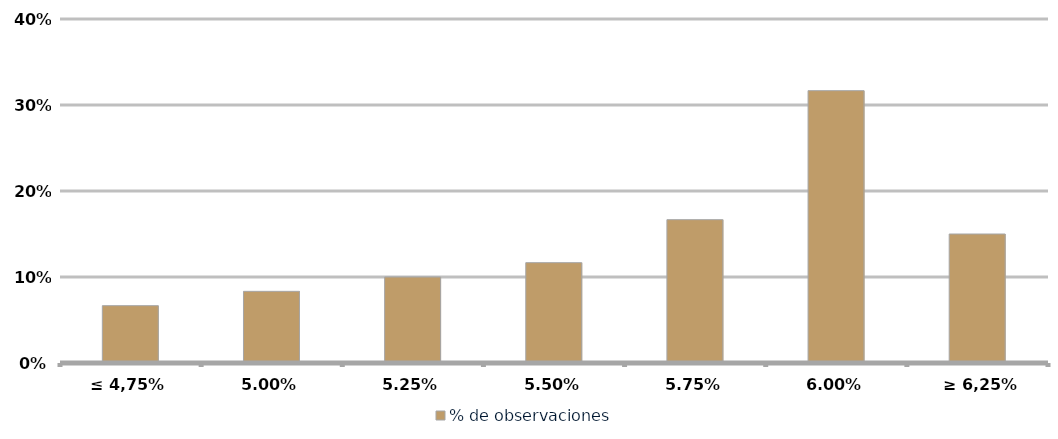
| Category | % de observaciones  |
|---|---|
| ≤ 4,75% | 0.067 |
| 5.00% | 0.083 |
| 5.25% | 0.1 |
| 5.50% | 0.117 |
| 5.75% | 0.167 |
| 6.00% | 0.317 |
|  ≥ 6,25% | 0.15 |